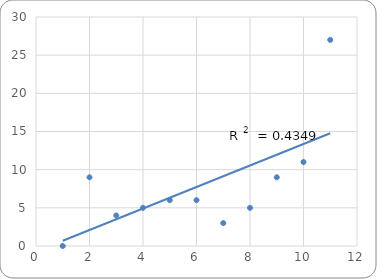
| Category | Series 0 |
|---|---|
| 0 | 0 |
| 1 | 9 |
| 2 | 4 |
| 3 | 5 |
| 4 | 6 |
| 5 | 6 |
| 6 | 3 |
| 7 | 5 |
| 8 | 9 |
| 9 | 11 |
| 10 | 27 |